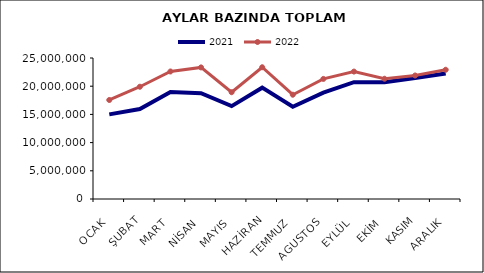
| Category | 2021 | 2022 |
|---|---|---|
| OCAK | 15003935.219 | 17553932.872 |
| ŞUBAT | 15952528.858 | 19904576.483 |
| MART | 18955706.115 | 22609916.172 |
| NİSAN | 18756865.083 | 23332061.588 |
| MAYIS | 16468343.399 | 18935100.849 |
| HAZİRAN | 19740427.009 | 23360895.579 |
| TEMMUZ | 16357698.212 | 18490317.221 |
| AGUSTOS | 18860976.378 | 21291905.88 |
| EYLÜL | 20715563.079 | 22594820.823 |
| EKİM | 20713984.277 | 21321186.605 |
| KASIM | 21455111.986 | 21900299.443 |
| ARALIK | 22233318.423 | 22914521.438 |